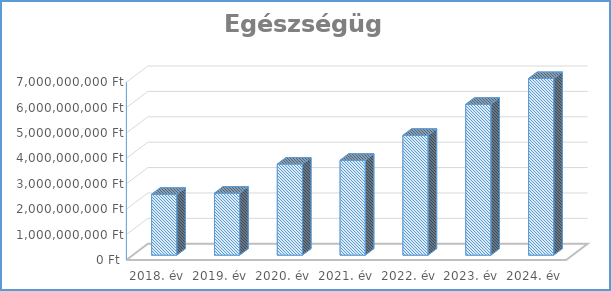
| Category | Egészségügy |
|---|---|
| 2018. év | 2395275486 |
| 2019. év | 2441519966 |
| 2020. év | 3584580395 |
| 2021. év | 3736015748 |
| 2022. év | 4717827798 |
| 2023. év | 5940157506 |
| 2024. év | 6955649237 |